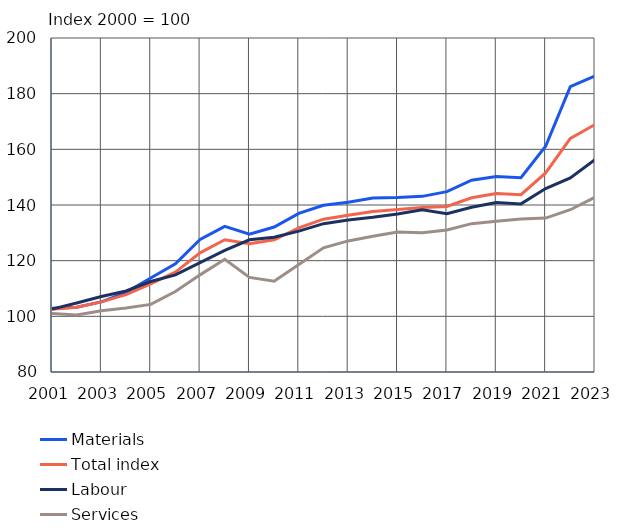
| Category | Materials | Total index | Labour | Services |
|---|---|---|---|---|
| 2001.0 | 102.9 | 102.5 | 102.6 | 101 |
| 2002.0 | 103.3 | 103.3 | 104.8 | 100.5 |
| 2003.0 | 105.2 | 105.2 | 107.1 | 102 |
| 2004.0 | 108.6 | 107.8 | 109.1 | 103 |
| 2005.0 | 113.8 | 111.7 | 112.5 | 104.3 |
| 2006.0 | 118.9 | 115.9 | 114.9 | 108.9 |
| 2007.0 | 127.6 | 122.8 | 119.3 | 114.9 |
| 2008.0 | 132.3 | 127.5 | 123.7 | 120.5 |
| 2009.0 | 129.5 | 126.1 | 127.5 | 114 |
| 2010.0 | 132.1 | 127.5 | 128.4 | 112.6 |
| 2011.0 | 137 | 131.8 | 130.6 | 118.6 |
| 2012.0 | 139.9 | 134.9 | 133.3 | 124.6 |
| 2013.0 | 141 | 136.3 | 134.6 | 127.1 |
| 2014.0 | 142.5 | 137.7 | 135.6 | 128.8 |
| 2015.0 | 142.7 | 138.4 | 136.8 | 130.3 |
| 2016.0 | 143.1 | 139.1 | 138.3 | 130 |
| 2017.0 | 144.8 | 139.5 | 136.9 | 131 |
| 2018.0 | 148.9 | 142.6 | 139.2 | 133.3 |
| 2019.0 | 150.2 | 144.1 | 140.9 | 134.2 |
| 2020.0 | 149.8 | 143.7 | 140.4 | 135 |
| 2021.0 | 161.1 | 151.5 | 145.9 | 135.3 |
| 2022.0 | 182.5 | 163.9 | 149.7 | 138.3 |
| 2023.0 | 186.4 | 168.9 | 156.3 | 142.8 |